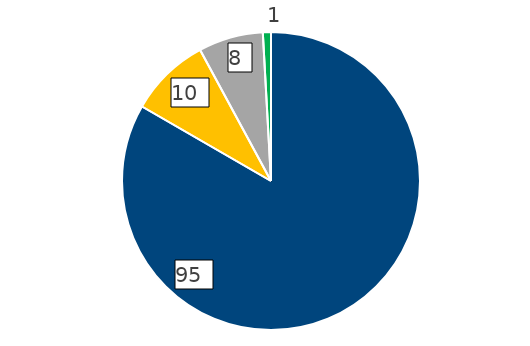
| Category | Series 0 |
|---|---|
| E-mail a Transparencia CORREOS | 95 |
| Correo postal a Transparencia CORREOS | 10 |
| Portal Transparencia AGE | 8 |
| Otros | 1 |